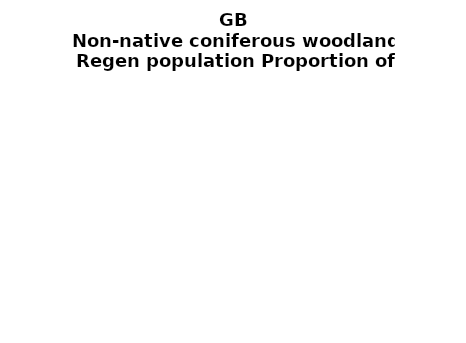
| Category | Non-native coniferous woodland |
|---|---|
| None | 0.108 |
| Seedlings only | 0 |
| Seedlings, saplings only | 0.059 |
| Seedlings, saplings, <7 cm trees | 0.142 |
| Saplings only | 0.122 |
| <7 cm trees, seedlings only | 0 |
| <7 cm trees, saplings only | 0.341 |
| <7 cm Trees only | 0.229 |